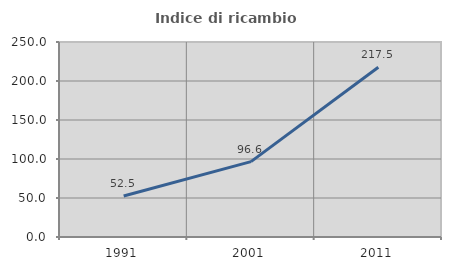
| Category | Indice di ricambio occupazionale  |
|---|---|
| 1991.0 | 52.537 |
| 2001.0 | 96.634 |
| 2011.0 | 217.539 |